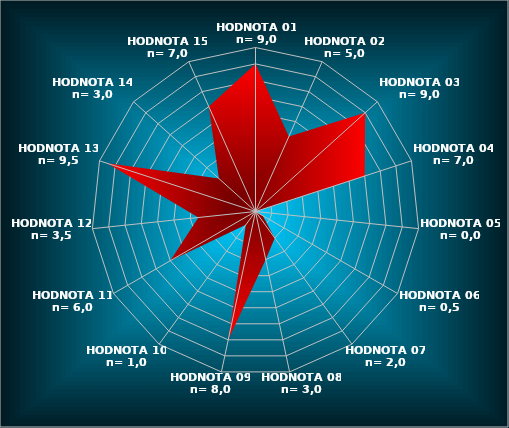
| Category | Series 0 |
|---|---|
| HODNOTA 01
n= 9,0 | 9 |
| HODNOTA 02
n= 5,0 | 5 |
| HODNOTA 03
n= 9,0 | 9 |
| HODNOTA 04
n= 7,0 | 7 |
| HODNOTA 05
n= 0,0 | 0 |
| HODNOTA 06
n= 0,5 | 0.5 |
| HODNOTA 07
n= 2,0 | 2 |
| HODNOTA 08
n= 3,0 | 3 |
| HODNOTA 09
n= 8,0 | 8 |
| HODNOTA 10
n= 1,0 | 1 |
| HODNOTA 11
n= 6,0 | 6 |
| HODNOTA 12
n= 3,5 | 3.5 |
| HODNOTA 13
n= 9,5 | 9.5 |
| HODNOTA 14
n= 3,0 | 3 |
| HODNOTA 15
n= 7,0 | 7 |